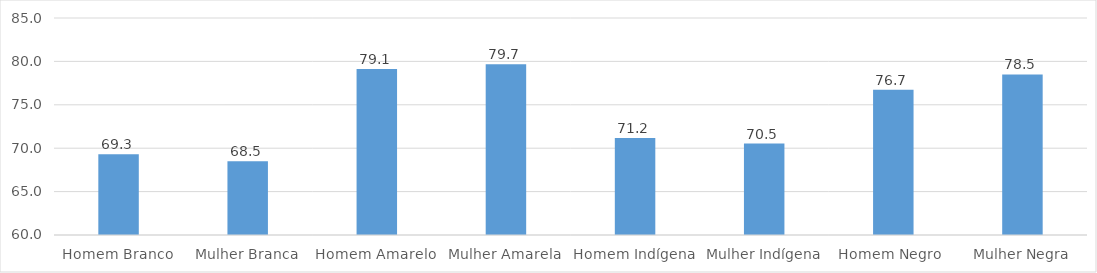
| Category | Series 0 |
|---|---|
| Homem Branco | 69.292 |
| Mulher Branca | 68.504 |
| Homem Amarelo | 79.137 |
| Mulher Amarela | 79.663 |
| Homem Indígena | 71.167 |
| Mulher Indígena | 70.527 |
| Homem Negro  | 76.723 |
| Mulher Negra | 78.492 |